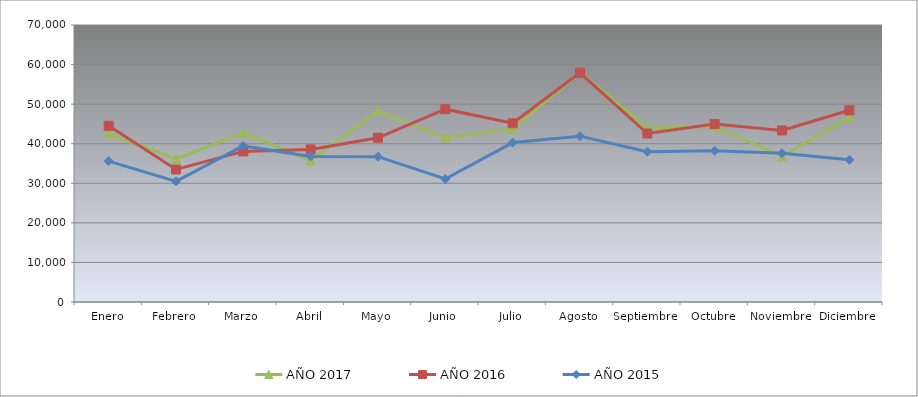
| Category | AÑO 2017 | AÑO 2016 | AÑO 2015 |
|---|---|---|---|
| Enero | 42588.112 | 44515.731 | 35594.927 |
| Febrero | 36190.017 | 33483.924 | 30490.56 |
| Marzo | 42773.077 | 38056.903 | 39446.403 |
| Abril | 35761.235 | 38562.764 | 36794.274 |
| Mayo | 48271.572 | 41504.849 | 36733.593 |
| Junio | 41541.38 | 48728.538 | 31090.234 |
| Julio | 43794.586 | 45171.326 | 40292.372 |
| Agosto | 57986.42 | 57919.013 | 41909.35 |
| Septiembre | 43962.736 | 42577.273 | 37961.497 |
| Octubre | 44357.888 | 44989.217 | 38222.069 |
| Noviembre | 36803.763 | 43350.228 | 37583.131 |
| Diciembre | 46644.723 | 48453.35 | 35923.319 |